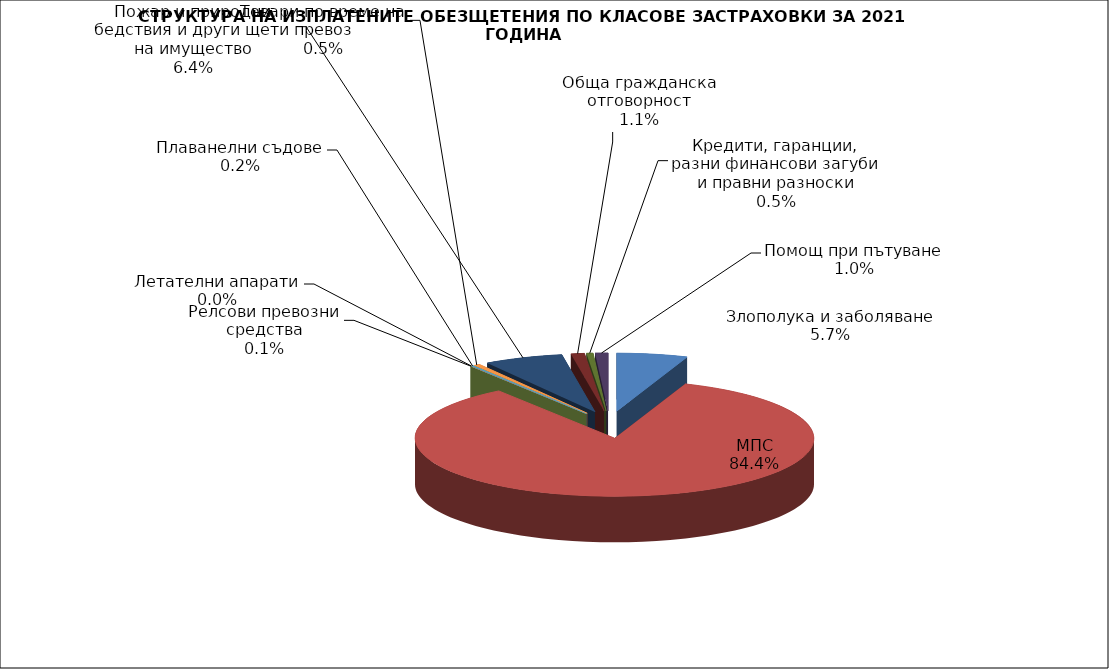
| Category | Злополука и заболяване |
|---|---|
| Злополука и заболяване | 0.057 |
| МПС | 0.844 |
| Релсови превозни средства | 0.001 |
| Летателни апарати | 0 |
| Плаванелни съдове | 0.002 |
| Товари по време на превоз | 0.005 |
| Пожар и природни бедствия и други щети на имущество | 0.064 |
| Обща гражданска отговорност | 0.011 |
| Кредити, гаранции, разни финансови загуби и правни разноски | 0.005 |
| Помощ при пътуване | 0.01 |